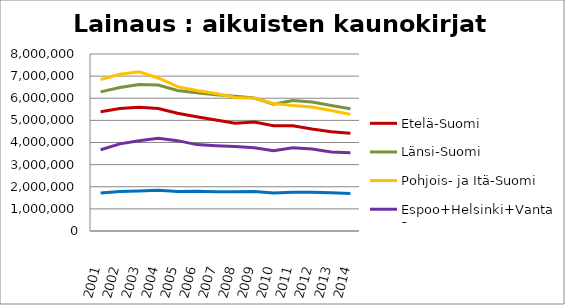
| Category | Etelä-Suomi | Länsi-Suomi | Pohjois- ja Itä-Suomi | Espoo+Helsinki+Vantaa | Muu Uusimaa |
|---|---|---|---|---|---|
| 2001.0 | 5390064 | 6287492 | 6841023 | 3673450 | 1722372 |
| 2002.0 | 5533624 | 6482820 | 7081844 | 3938021 | 1789371 |
| 2003.0 | 5598159 | 6623080 | 7197227 | 4076476 | 1809005 |
| 2004.0 | 5539359 | 6599112 | 6915568 | 4188148 | 1841962 |
| 2005.0 | 5324023 | 6349319 | 6526641 | 4083865 | 1783725 |
| 2006.0 | 5167207 | 6252894 | 6353296 | 3905147 | 1797167 |
| 2007.0 | 5013270 | 6161219 | 6216171 | 3854558 | 1773218 |
| 2008.0 | 4874593 | 6087298 | 6038985 | 3817235 | 1776991 |
| 2009.0 | 4930823 | 6009826 | 5999294 | 3757995 | 1783640 |
| 2010.0 | 4756345 | 5734111 | 5765428 | 3633055 | 1719354 |
| 2011.0 | 4759913 | 5900636 | 5674040 | 3760891 | 1747788 |
| 2012.0 | 4610258 | 5832072 | 5605353 | 3703487 | 1751841 |
| 2013.0 | 4490395 | 5674463 | 5445382 | 3569406 | 1730759 |
| 2014.0 | 4418148 | 5524204 | 5271935 | 3537350 | 1698393 |